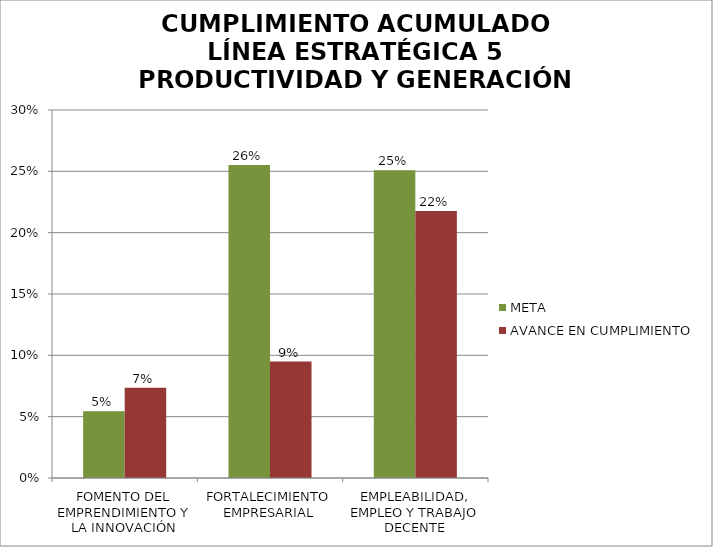
| Category | META | AVANCE EN CUMPLIMIENTO |
|---|---|---|
| FOMENTO DEL EMPRENDIMIENTO Y LA INNOVACIÓN | 0.054 | 0.074 |
| FORTALECIMIENTO EMPRESARIAL | 0.255 | 0.095 |
| EMPLEABILIDAD, EMPLEO Y TRABAJO DECENTE | 0.251 | 0.218 |